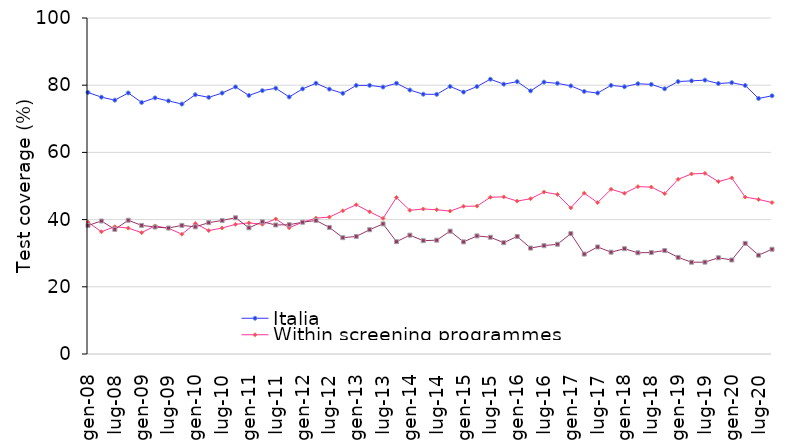
| Category | Italia | Within screening programmes | Outside the screening programme |
|---|---|---|---|
| gen-08 | 77.841 | 39.236 | 38.257 |
| apr-08 | 76.445 | 36.392 | 39.582 |
| lug-08 | 75.55 | 37.882 | 37.091 |
| ott-08 | 77.694 | 37.47 | 39.81 |
| gen-09 | 74.861 | 36.116 | 38.277 |
| apr-09 | 76.235 | 38.122 | 37.792 |
| lug-09 | 75.33 | 37.412 | 37.491 |
| ott-09 | 74.394 | 35.66 | 38.28 |
| gen-10 | 77.161 | 38.846 | 37.837 |
| apr-10 | 76.385 | 36.742 | 39.082 |
| lug-10 | 77.66 | 37.492 | 39.751 |
| ott-10 | 79.494 | 38.6 | 40.55 |
| gen-11 | 76.951 | 39.016 | 37.557 |
| apr-11 | 78.385 | 38.612 | 39.342 |
| lug-11 | 79.09 | 40.182 | 38.401 |
| ott-11 | 76.504 | 37.55 | 38.48 |
| gen-12 | 78.901 | 39.246 | 39.217 |
| apr-12 | 80.585 | 40.432 | 39.742 |
| lug-12 | 78.83 | 40.752 | 37.681 |
| ott-12 | 77.584 | 42.62 | 34.62 |
| gen-13 | 79.941 | 44.416 | 34.987 |
| apr-13 | 79.945 | 42.322 | 36.992 |
| lug-13 | 79.45 | 40.362 | 38.721 |
| ott-13 | 80.564 | 46.57 | 33.43 |
| gen-14 | 78.571 | 42.756 | 35.367 |
| apr-14 | 77.315 | 43.162 | 33.722 |
| lug-14 | 77.27 | 42.942 | 33.881 |
| ott-14 | 79.624 | 42.52 | 36.56 |
| gen-15 | 77.961 | 43.966 | 33.367 |
| apr-15 | 79.595 | 44.012 | 35.142 |
| lug-15 | 81.78 | 46.652 | 34.751 |
| ott-15 | 80.304 | 46.76 | 33.13 |
| gen-16 | 81.061 | 45.516 | 34.987 |
| apr-16 | 78.305 | 46.212 | 31.522 |
| lug-16 | 80.91 | 48.192 | 32.241 |
| ott-16 | 80.544 | 47.48 | 32.67 |
| gen-17 | 79.801 | 43.496 | 35.817 |
| apr-17 | 78.145 | 47.862 | 29.742 |
| lug-17 | 77.68 | 45.062 | 31.851 |
| ott-17 | 79.954 | 49.02 | 30.31 |
| gen-18 | 79.541 | 47.846 | 31.337 |
| apr-18 | 80.435 | 49.812 | 30.122 |
| lug-18 | 80.23 | 49.672 | 30.201 |
| ott-18 | 78.934 | 47.74 | 30.8 |
| gen-19 | 81.081 | 51.986 | 28.767 |
| apr-19 | 81.295 | 53.582 | 27.312 |
| lug-19 | 81.51 | 53.762 | 27.341 |
| ott-19 | 80.494 | 51.31 | 28.64 |
| gen-20 | 80.761 | 52.396 | 27.977 |
| apr-20 | 79.925 | 46.702 | 32.932 |
| lug-20 | 76.06 | 46.002 | 29.401 |
| ott-20 | 76.844 | 45.08 | 31.18 |